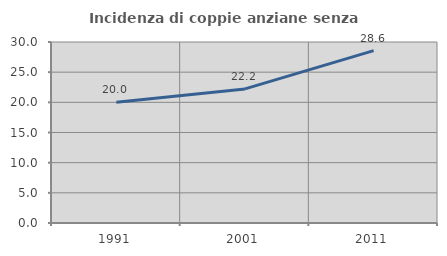
| Category | Incidenza di coppie anziane senza figli  |
|---|---|
| 1991.0 | 20 |
| 2001.0 | 22.222 |
| 2011.0 | 28.571 |